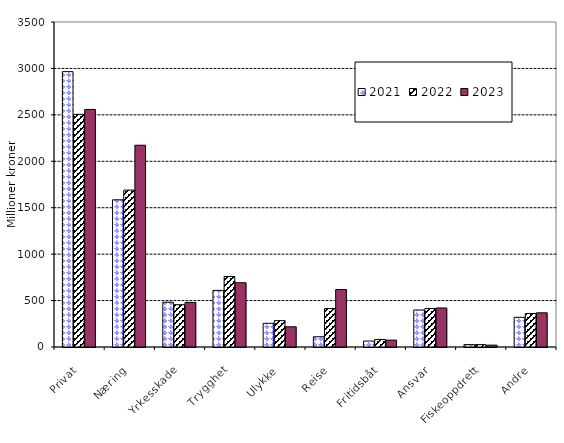
| Category | 2021 | 2022 | 2023 |
|---|---|---|---|
| Privat | 2965.42 | 2505.677 | 2558.357 |
| Næring | 1585.404 | 1689.918 | 2172.859 |
| Yrkesskade | 482.143 | 455.453 | 480.091 |
| Trygghet | 609.675 | 759.557 | 691.947 |
| Ulykke | 254.936 | 283.756 | 217.717 |
| Reise | 110.552 | 414.366 | 619.341 |
| Fritidsbåt | 64.209 | 81.147 | 74.039 |
| Ansvar | 398.642 | 414.927 | 420.457 |
| Fiskeoppdrett | 25.507 | 25.872 | 20.317 |
| Andre | 319.626 | 360.989 | 368.303 |